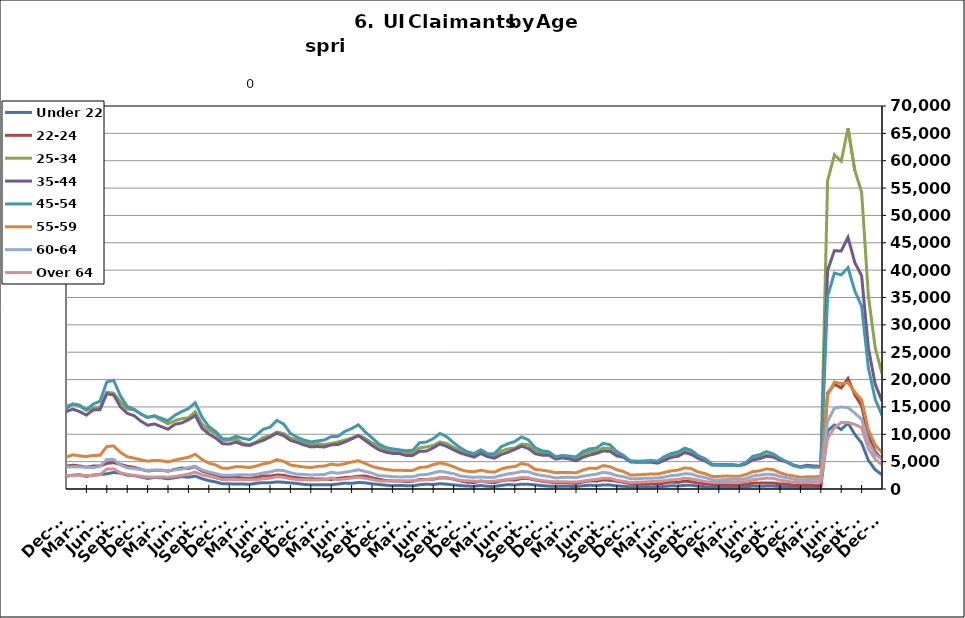
| Category | Under 22 | 22-24 | 25-34 | 35-44 | 45-54 | 55-59 | 60-64 | Over 64 |
|---|---|---|---|---|---|---|---|---|
| 1995-02-28 | 535 | 933 | 5740 | 6206 | 4029 | 1255 | 625 | 276 |
| 1995-03-31 | 534 | 992 | 5856 | 6433 | 4297 | 1294 | 686 | 323 |
| 1995-04-30 | 603 | 1125 | 6814 | 6965 | 4447 | 1392 | 730 | 338 |
| 1995-05-31 | 626 | 1171 | 7442 | 7404 | 4702 | 1383 | 751 | 333 |
| 1995-06-30 | 625 | 1218 | 7514 | 7778 | 4867 | 1435 | 813 | 366 |
| 1995-07-31 | 710 | 1296 | 8612 | 8864 | 5537 | 1595 | 891 | 407 |
| 1995-08-31 | 729 | 1248 | 8185 | 8719 | 5400 | 1604 | 982 | 406 |
| 1995-09-30 | 578 | 1028 | 6615 | 7150 | 4534 | 1351 | 862 | 338 |
| 1995-10-31 | 554 | 957 | 5805 | 6461 | 4159 | 1205 | 741 | 287 |
| 1995-11-30 | 468 | 845 | 5201 | 5826 | 3927 | 1155 | 702 | 254 |
| 1995-12-31 | 517 | 858 | 5350 | 5974 | 4010 | 1153 | 672 | 263 |
| 1996-01-31 | 543 | 927 | 5431 | 6086 | 4208 | 1221 | 685 | 301 |
| 1996-02-29 | 617 | 999 | 5667 | 6535 | 4480 | 1312 | 747 | 305 |
| 1996-03-31 | 622 | 981 | 5896 | 6557 | 4514 | 1362 | 763 | 306 |
| 1996-04-30 | 680 | 1140 | 7032 | 7649 | 5088 | 1527 | 856 | 345 |
| 1996-05-31 | 689 | 1163 | 7220 | 7819 | 5070 | 1521 | 832 | 366 |
| 1996-06-30 | 661 | 1145 | 7344 | 8173 | 5391 | 1568 | 844 | 388 |
| 1996-07-31 | 762 | 1250 | 8375 | 9181 | 6036 | 1755 | 973 | 432 |
| 1996-08-31 | 746 | 1145 | 7829 | 8585 | 5586 | 1651 | 950 | 435 |
| 1996-09-30 | 635 | 992 | 6399 | 7097 | 4790 | 1462 | 804 | 425 |
| 1996-10-31 | 572 | 851 | 5448 | 6291 | 4192 | 1259 | 693 | 340 |
| 1996-11-30 | 531 | 827 | 5003 | 5921 | 3908 | 1153 | 602 | 315 |
| 1996-12-31 | 521 | 789 | 4710 | 5510 | 3673 | 1110 | 610 | 284 |
| 1997-01-31 | 559 | 841 | 5203 | 6172 | 4321 | 1255 | 731 | 328 |
| 1997-02-28 | 556 | 841 | 5187 | 6162 | 4311 | 1250 | 727 | 326 |
| 1997-03-31 | 499 | 806 | 5125 | 6037 | 4176 | 1294 | 702 | 363 |
| 1997-04-30 | 545 | 885 | 5753 | 6709 | 4248 | 1339 | 734 | 339 |
| 1997-05-31 | 612 | 941 | 6146 | 7153 | 4458 | 1348 | 801 | 336 |
| 1997-06-30 | 623 | 995 | 6240 | 7298 | 4662 | 1302 | 776 | 348 |
| 1997-07-31 | 716 | 1154 | 7168 | 8554 | 5489 | 1509 | 903 | 415 |
| 1997-08-31 | 684 | 1072 | 6853 | 8093 | 5222 | 1487 | 837 | 416 |
| 1997-09-30 | 579 | 912 | 5522 | 6592 | 4348 | 1285 | 705 | 380 |
| 1997-10-31 | 516 | 817 | 4894.5 | 5892.5 | 3945 | 1159 | 625 | 344.5 |
| 1997-11-30 | 453 | 722 | 4267 | 5193 | 3542 | 1033 | 545 | 309 |
| 1997-12-31 | 413 | 682 | 3792 | 4755 | 3300 | 1023 | 490 | 266 |
| 1998-01-31 | 489 | 741 | 4044 | 5115 | 3513 | 1099 | 525 | 267 |
| 1998-02-28 | 435 | 684 | 3864 | 4903 | 3549 | 1043 | 571 | 285 |
| 1998-03-31 | 416 | 680 | 3855 | 5086 | 3703 | 1176 | 604 | 297 |
| 1998-04-30 | 592 | 813 | 5092 | 6219 | 4262 | 1336 | 688 | 332 |
| 1998-05-31 | 579 | 849 | 5319 | 6766 | 4554 | 1382 | 729 | 360 |
| 1998-06-30 | 568 | 899 | 5557 | 7101 | 4897 | 1405 | 783 | 367 |
| 1998-07-31 | 691 | 1031 | 6472 | 8095 | 5562 | 1589 | 880 | 392 |
| 1998-08-31 | 673 | 1007 | 6326 | 7950 | 5369 | 1574 | 935 | 393 |
| 1998-09-30 | 548 | 838 | 5206 | 6768 | 4703 | 1432 | 849 | 373 |
| 1998-10-31 | 496 | 776 | 4437 | 5582 | 3875 | 1250 | 711 | 302 |
| 1998-11-30 | 456 | 761 | 4182 | 5332 | 4015 | 1296 | 694 | 308 |
| 1998-12-31 | 442 | 722 | 4010 | 5198 | 4062 | 1331 | 656 | 290 |
| 1999-01-31 | 503 | 830 | 4502 | 5761 | 4521 | 1490 | 751 | 297 |
| 1999-02-28 | 463 | 756 | 4267 | 5576 | 4431 | 1470 | 767 | 301 |
| 1999-03-31 | 435 | 688 | 4119 | 5519 | 4403 | 1516 | 765 | 331 |
| 1999-04-30 | 591 | 949 | 5292 | 7089 | 5468 | 1724 | 914 | 489 |
| 1999-05-31 | 674 | 911 | 5611 | 7459 | 5457 | 1710 | 934 | 500 |
| 1999-06-30 | 640 | 906 | 5660 | 7503 | 5333 | 1695 | 920 | 495 |
| 1999-07-31 | 766 | 1132 | 6820 | 9256 | 6620 | 1981 | 1001 | 549 |
| 1999-08-31 | 738 | 1117 | 6737 | 9030 | 6670 | 2019 | 1075 | 582 |
| 1999-09-30 | 600 | 968 | 5167 | 7169 | 5458 | 1712 | 892 | 465 |
| 1999-10-31 | 494 | 813 | 4501 | 6048 | 4682 | 1443 | 743 | 363 |
| 1999-11-30 | 464 | 768 | 4228 | 5593 | 4564 | 1392 | 702 | 313 |
| 1999-12-31 | 468.5 | 754.5 | 4149 | 5486.5 | 4505 | 1429 | 673 | 304 |
| 2000-01-31 | 473 | 741 | 4070 | 5380 | 4446 | 1466 | 644 | 295 |
| 2000-02-29 | 460 | 691 | 3807 | 5357 | 4470 | 1469 | 707 | 310 |
| 2000-03-31 | 412 | 652 | 3864 | 5499 | 4568 | 1508 | 816 | 389 |
| 2000-04-30 | 585 | 829 | 4741 | 6891 | 5127 | 1631 | 906 | 451 |
| 2000-05-31 | 627 | 875 | 5086 | 7211 | 5238 | 1598 | 956 | 489 |
| 2000-06-30 | 675 | 983 | 5624 | 7826 | 5562 | 1669 | 941 | 524 |
| 2000-07-31 | 802 | 1109 | 6475 | 9102 | 6450 | 1927 | 1097 | 594 |
| 2000-08-31 | 787 | 1058 | 6045 | 8732 | 6157 | 1894 | 1085 | 616 |
| 2000-09-30 | 607 | 897 | 4766 | 6864 | 5037 | 1486 | 902 | 479 |
| 2000-10-31 | 544 | 760 | 4267 | 5897 | 4465 | 1323 | 762 | 394 |
| 2000-11-30 | 535 | 797 | 3982 | 5439 | 4318 | 1256 | 702 | 396 |
| 2000-12-31 | 508 | 832 | 3891 | 5255 | 4218 | 1246 | 694 | 361 |
| 2001-01-31 | 627 | 892 | 4229 | 5724 | 4777 | 1300 | 721 | 393 |
| 2001-02-28 | 643 | 934 | 4553 | 6302 | 5224 | 1529 | 849 | 472 |
| 2001-03-31 | 412 | 648 | 3625 | 5081 | 4551 | 1413 | 778 | 440 |
| 2001-04-30 | 875 | 1276 | 6577 | 8914 | 7196 | 2144 | 1185 | 639 |
| 2001-05-31 | 944 | 1399 | 7133 | 9570 | 7651 | 2265 | 1231 | 679 |
| 2001-06-30 | 1041 | 1584 | 8072 | 11034 | 8621 | 2613 | 1398 | 756 |
| 2001-07-31 | 1135 | 1806 | 9038 | 12514 | 9691 | 2970 | 1611 | 848 |
| 2001-08-31 | 1116 | 1776 | 8753 | 12045 | 9560 | 2963 | 1691 | 898 |
| 2001-09-30 | 1046 | 1705 | 8118 | 11025 | 8788 | 2784 | 1608 | 833 |
| 2001-10-31 | 1094 | 1785 | 8459 | 11114 | 8850 | 2772 | 1610 | 777 |
| 2001-11-30 | 1154 | 1931 | 9131 | 11576 | 9447 | 2973 | 1661 | 778 |
| 2001-12-31 | 1280 | 2191 | 9917 | 11961 | 9905 | 3152 | 1740 | 780 |
| 2002-01-31 | 1330 | 2255 | 10364 | 12730 | 10592 | 3378 | 1843 | 821 |
| 2002-02-28 | 1347 | 2339 | 10349 | 12730 | 10784 | 3499 | 1861 | 867 |
| 2002-03-31 | 1266 | 2231 | 9963 | 12747 | 10614 | 3499 | 1867 | 979 |
| 2002-04-30 | 1412 | 2488 | 11603 | 15825 | 13571 | 4631 | 2389 | 1146 |
| 2002-05-31 | 1455 | 2421 | 11243 | 15509 | 13148 | 4374 | 2359 | 1195 |
| 2002-06-30 | 1534 | 2479 | 11416 | 15594 | 13261 | 4343 | 2365 | 1180 |
| 2002-07-31 | 1513 | 2614 | 11895 | 16242 | 13727 | 4439 | 2428 | 1255 |
| 2002-08-31 | 1022 | 1977 | 8719 | 12054 | 10588 | 3454 | 1990 | 1047 |
| 2002-09-30 | 1391 | 2528 | 10478 | 14010 | 12008 | 3847 | 2161 | 1166 |
| 2002-10-31 | 1401 | 2385 | 9826 | 12727 | 10778 | 3498 | 1886 | 973 |
| 2002-11-30 | 1344 | 2390 | 9846 | 12059 | 10297 | 3367 | 1833 | 958 |
| 2002-12-31 | 1311 | 2403 | 9841 | 11670 | 10177 | 3369 | 1871 | 894 |
| 2003-01-31 | 1311 | 2403 | 9841 | 11670 | 10177 | 3369 | 1871 | 894 |
| 2003-02-28 | 1367 | 2275 | 9730 | 12433 | 10806 | 3687 | 2016 | 974 |
| 2003-03-31 | 1367 | 2357 | 9844 | 12620 | 11167 | 3825 | 2151 | 1094 |
| 2003-04-30 | 1549 | 2525 | 10619 | 14142 | 12182 | 4004 | 2304 | 1190 |
| 2003-05-31 | 1663 | 2698 | 10843 | 14795 | 12539 | 4102 | 2395 | 1256 |
| 2003-06-30 | 1755 | 2770 | 11350 | 15575 | 13251 | 4301 | 2493 | 1325 |
| 2003-07-31 | 1748 | 2791 | 11577 | 15863 | 13772 | 4465 | 2593 | 1371 |
| 2003-08-31 | 1718 | 2653 | 10998 | 15261 | 13219 | 4325 | 2522 | 1359 |
| 2003-09-30 | 1494 | 2521 | 10071 | 13565 | 11659 | 3828 | 2278 | 1286 |
| 2003-10-31 | 1329 | 2432 | 9388 | 12107 | 10693 | 3567 | 2036 | 1129 |
| 2003-11-30 | 1191 | 2226 | 8954 | 11297 | 10037 | 3414 | 2004 | 1068 |
| 2003-12-31 | 1206 | 2184 | 8530 | 10413 | 9335 | 3215 | 1854 | 994 |
| 2004-01-31 | 1216 | 2171 | 8382 | 9858 | 8955 | 2992 | 1736 | 963 |
| 2004-02-29 | 1118 | 1879 | 7614 | 8935 | 8176 | 2761 | 1617 | 943 |
| 2004-03-31 | 1099 | 1749 | 7152 | 8565 | 7769 | 2686 | 1608 | 981 |
| 2004-04-30 | 1241 | 1951 | 7653 | 9981 | 8741 | 2872 | 1685 | 1056 |
| 2004-05-31 | 1245 | 1934 | 7651 | 10203 | 8820 | 2928 | 1703 | 1079 |
| 2004-06-30 | 1316 | 2086 | 8172 | 10636 | 9362 | 3146 | 1843 | 1081 |
| 2004-07-31 | 1476 | 2265 | 8795 | 11511 | 10439 | 3497 | 2008 | 1171 |
| 2004-08-31 | 1390 | 2055 | 8008 | 10418 | 9514 | 3304 | 1909 | 1105 |
| 2004-09-30 | 1129 | 1820 | 6987 | 8661 | 7694 | 2755 | 1623 | 1046 |
| 2004-10-31 | 1037 | 1675 | 6590 | 7964 | 7029 | 2459 | 1461 | 882 |
| 2004-11-30 | 954 | 1638 | 6342 | 7570 | 6733 | 2294 | 1383 | 841 |
| 2004-12-31 | 857 | 1533 | 5921 | 6991 | 6333 | 2225 | 1287 | 764 |
| 2005-01-31 | 893 | 1539 | 6047 | 7410 | 6682 | 2253 | 1274 | 788 |
| 2005-02-28 | 846 | 1361 | 5650 | 6952 | 6404 | 2198 | 1326 | 786 |
| 2005-03-31 | 747 | 1258 | 5313 | 6595 | 6251 | 2151 | 1327 | 742 |
| 2005-04-30 | 877 | 1375 | 5696 | 7717 | 7230 | 2440 | 1401 | 844 |
| 2005-05-31 | 854 | 1408 | 5674 | 7905 | 7454 | 2482 | 1453 | 858 |
| 2005-06-30 | 819 | 1444 | 6028 | 8565 | 7899 | 2613 | 1547 | 890 |
| 2005-07-31 | 900 | 1461 | 6395 | 9124 | 8614 | 2864 | 1640 | 1004 |
| 2005-08-31 | 805 | 1439 | 5917 | 8271 | 8076 | 2692 | 1587 | 945 |
| 2005-09-30 | 631 | 1209 | 4978 | 6413 | 6203 | 2116 | 1312 | 724 |
| 2005-10-31 | 638 | 1134 | 4602 | 6028 | 5688 | 1997 | 1171 | 656 |
| 2005-11-30 | 564 | 1071 | 4409 | 5563 | 5105 | 1791 | 1035 | 580 |
| 2005-12-31 | 523 | 987 | 4014 | 4983 | 4531 | 1673 | 968 | 546 |
| 2006-01-31 | 531 | 925 | 3900 | 5012 | 4793 | 1691 | 1008 | 539 |
| 2006-02-28 | 447 | 804 | 3534 | 4388 | 4403 | 1586 | 980 | 549 |
| 2006-03-31 | 399 | 785 | 3455 | 4472 | 4584 | 1680 | 1069 | 618 |
| 2006-04-30 | 527 | 945 | 4004 | 5859 | 5921 | 1965 | 1251 | 744 |
| 2006-05-31 | 594 | 964 | 4205 | 6365 | 6369 | 2156 | 1327 | 792 |
| 2006-06-30 | 660 | 1113 | 4742 | 7052 | 7094 | 2386 | 1474 | 933 |
| 2006-07-31 | 771 | 1183 | 5214 | 7974 | 8007 | 2685 | 1635 | 1072 |
| 2006-08-31 | 737 | 1202 | 5116 | 7524 | 7553 | 2671 | 1590 | 1019 |
| 2006-09-30 | 596 | 1086 | 4608 | 6175 | 6389 | 2256 | 1287 | 812 |
| 2006-10-31 | 596 | 1056 | 4585 | 5758 | 5788 | 2026 | 1164 | 696 |
| 2006-11-30 | 542 | 1003 | 4370 | 5304 | 5388 | 1812 | 1082 | 604 |
| 2006-12-31 | 553 | 1102 | 4425 | 5291 | 5310 | 1801 | 1099 | 603 |
| 2007-01-31 | 587 | 1147 | 4542 | 5619 | 5506 | 1920 | 1174 | 663 |
| 2007-02-28 | 544 | 1090 | 4490 | 5562 | 5616 | 1982 | 1260 | 705 |
| 2007-03-31 | 558 | 1089 | 4498 | 5595 | 5708 | 2016 | 1378 | 717 |
| 2007-04-30 | 760 | 1203 | 5015 | 6827 | 6871 | 2316 | 1536 | 856 |
| 2007-05-31 | 806 | 1285 | 5542 | 7679 | 7763 | 2571 | 1719 | 1021 |
| 2007-06-30 | 862 | 1340 | 6100 | 8324 | 8341 | 2812 | 1896 | 1060 |
| 2007-07-31 | 980 | 1524 | 6616 | 9184 | 9522 | 3226 | 2038 | 1250 |
| 2007-08-31 | 950 | 1510 | 6266 | 8359 | 8842 | 3033 | 1949 | 1157 |
| 2007-09-30 | 865 | 1595 | 6213 | 7798 | 7957 | 2790 | 1816 | 1090 |
| 2007-10-31 | 883 | 1517 | 6214 | 7229 | 7503 | 2574 | 1630 | 978 |
| 2007-11-15 | 816 | 1424 | 5981 | 6740 | 6999 | 2468 | 1510 | 860 |
| 2007-12-15 09:36:00 | 851 | 1536 | 6411 | 6986 | 7174 | 2572 | 1584 | 874 |
| 2008-01-14 19:12:00 | 963 | 1628 | 6836 | 7533 | 7742 | 2786 | 1744 | 940 |
| 2008-02-14 04:48:00 | 982 | 1565 | 6847 | 7767 | 8031 | 2958 | 1823 | 985 |
| 2008-03-15 14:24:00 | 1029 | 1666 | 7210 | 8036 | 8353 | 3105 | 1898 | 1085 |
| 2008-04-15 | 1182 | 1889 | 7894 | 9339 | 9822 | 3537 | 2184 | 1246 |
| 2008-05-15 09:36:00 | 1325 | 2099 | 8651 | 10315 | 11003 | 3871 | 2423 | 1448 |
| 2008-06-14 19:12:00 | 1405 | 2238 | 9567 | 11330 | 12040 | 4322 | 2650 | 1572 |
| 2008-07-15 04:48:00 | 1616 | 2488 | 10336 | 12349 | 13396 | 4698 | 3083 | 1801 |
| 2008-08-14 14:24:00 | 1753 | 2665 | 10716 | 12486 | 13444 | 4795 | 3139 | 1802 |
| 2008-09-14 | 1800 | 2924 | 11552 | 12686 | 13602 | 4801 | 3180 | 1811 |
| 2008-10-14 09:36:00 | 1936 | 3131 | 12284 | 13322 | 13831 | 4989 | 3183 | 1808 |
| 2008-11-13 19:12:00 | 2093 | 3414 | 13577 | 14724 | 15130 | 5413 | 3440 | 1946 |
| 2008-12-14 04:48:00 | 2495 | 4020 | 15380 | 16325 | 16846 | 6098 | 3755 | 2155 |
| 2009-01-13 14:24:00 | 3054 | 4678 | 17678 | 18452 | 19095 | 6788 | 4182 | 2364 |
| 2009-02-13 | 3531 | 5304 | 19793 | 20788 | 21601 | 7727 | 4836 | 2718 |
| 2009-03-15 09:36:00 | 3891 | 5925 | 22303 | 23139 | 24352 | 8876 | 5515 | 3141 |
| 2009-04-14 19:12:00 | 4291 | 6403 | 23925 | 25362 | 26817 | 9618 | 6020 | 3494 |
| 2009-05-15 04:48:00 | 4410 | 6521 | 24301 | 25794 | 27238 | 9735 | 6181 | 3529 |
| 2009-06-14 14:24:00 | 4405 | 6853 | 25234 | 26806 | 28296 | 10256 | 6673 | 3804 |
| 2009-07-15 | 4729 | 7280 | 26132 | 27836 | 29724 | 10830 | 6950 | 4125 |
| 2009-08-14 09:36:00 | 4717 | 7069 | 25281 | 26184 | 27877 | 10164 | 6719 | 3918 |
| 2009-09-13 19:12:00 | 4741 | 7291 | 25029 | 24981 | 26018 | 9679 | 6210 | 3594 |
| 2009-10-14 04:48:00 | 4656 | 7051 | 24241 | 23779 | 24730 | 9034 | 5817 | 3422 |
| 2009-11-13 14:24:00 | 4421 | 6817 | 23760 | 22851 | 23515 | 8627 | 5549 | 3297 |
| 2009-12-14 | 4232 | 6586 | 23118 | 22038 | 22501 | 8496 | 5370 | 3295 |
| 2010-01-13 09:36:00 | 4276 | 6583 | 22706 | 21421 | 22132 | 8135 | 5154 | 3134 |
| 2010-02-12 19:12:00 | 4133 | 6142 | 21386 | 20012 | 21036 | 7728 | 5039 | 3047 |
| 2010-03-15 04:48:00 | 3784 | 5822 | 20418 | 19073 | 20556 | 7446 | 4983 | 3062 |
| 2010-04-14 14:24:00 | 3731 | 5751 | 20058 | 19261 | 21012 | 7449 | 5078 | 2936 |
| 2010-05-15 | 3516 | 5553 | 19393 | 18793 | 20409 | 7213 | 4923 | 2915 |
| 2010-06-14 09:36:00 | 3450 | 5640 | 19615 | 19385 | 20781 | 7547 | 5293 | 3043 |
| 2010-07-14 19:12:00 | 3536 | 5781 | 19820 | 19714 | 21269 | 7946 | 5439 | 3330 |
| 2010-08-14 04:48:00 | 3477 | 5590 | 18902 | 18548 | 19686 | 7561 | 5039 | 3181 |
| 2010-09-13 14:24:00 | 3083 | 5332 | 17344 | 16712 | 17408 | 6775 | 4612 | 2859 |
| 2010-10-14 | 3004 | 5138 | 17187 | 16492 | 17042 | 6713 | 4418 | 2779 |
| 2010-11-13 09:36:00 | 2724 | 4771 | 16387 | 15438 | 16061 | 6360 | 4209 | 2601 |
| 2010-12-13 19:12:00 | 2335 | 4159 | 15175 | 14143 | 14646 | 5823 | 4003 | 2480 |
| 2011-01-13 04:48:00 | 2530 | 4343 | 15492 | 14596 | 15561 | 6250 | 4059 | 2487 |
| 2011-02-12 14:24:00 | 2609 | 4202 | 15131 | 14142 | 15320 | 6044 | 4041 | 2517 |
| 2011-03-15 | 2290 | 3998 | 14370 | 13505 | 14523 | 5925 | 3990 | 2470 |
| 2011-04-14 09:36:00 | 2563 | 4190 | 14834 | 14445 | 15508 | 6130 | 3916 | 2488 |
| 2011-05-14 19:12:00 | 2642 | 4217 | 14917 | 14494 | 16051 | 6156 | 4129 | 2602 |
| 2011-06-14 04:48:00 | 2767 | 4676 | 17673 | 17404 | 19563 | 7763 | 5398 | 3653 |
| 2011-07-14 14:24:00 | 3027 | 4815 | 17530 | 17197 | 19880 | 7870 | 5384 | 3686 |
| 2011-08-14 | 2900 | 4498 | 15970 | 15020 | 17035 | 6697 | 4394 | 2956 |
| 2011-09-13 09:36:00 | 2531 | 4156 | 14609 | 13818 | 15092 | 5903 | 3881 | 2687 |
| 2011-10-13 19:12:00 | 2452 | 3959 | 14501 | 13415 | 14565 | 5635 | 3734 | 2491 |
| 2011-11-13 04:48:00 | 2197 | 3615 | 13732 | 12410 | 13698 | 5345 | 3574 | 2339 |
| 2011-12-13 14:24:00 | 1938 | 3290 | 13130 | 11646 | 13054 | 5089 | 3380 | 2177 |
| 2012-01-13 | 2098 | 3424 | 13293 | 11897 | 13400 | 5218 | 3448 | 2197 |
| 2012-02-12 09:36:00 | 2047 | 3428 | 12569 | 11400 | 12931 | 5177 | 3445 | 2212 |
| 2012-03-13 19:12:00 | 1870 | 3252 | 11913 | 10922 | 12476 | 4948 | 3317 | 2155 |
| 2012-04-13 04:48:00 | 2063 | 3590 | 12479 | 11814 | 13464 | 5278 | 3509 | 2287 |
| 2012-05-13 14:24:00 | 2260 | 3828 | 12852 | 12063 | 14139 | 5562 | 3628 | 2485 |
| 2012-06-13 | 2147 | 3747 | 13008 | 12659 | 14694 | 5791 | 3902 | 2736 |
| 2012-07-13 09:36:00 | 2358 | 4087 | 14109 | 13412 | 15770 | 6346 | 4156 | 3086 |
| 2012-08-12 19:12:00 | 1887 | 3284 | 11852 | 11102 | 13153 | 5396 | 3487 | 2583 |
| 2012-09-12 04:48:00 | 1524 | 2903 | 10742 | 10051 | 11393 | 4726 | 3103 | 2327 |
| 2012-10-12 14:24:00 | 1289 | 2603 | 10123 | 9339 | 10510 | 4405 | 2813 | 2032 |
| 2012-11-12 | 945 | 2155 | 8870 | 8273 | 9193 | 3781 | 2520 | 1702 |
| 2012-12-12 09:36:00 | 937 | 2201 | 8913 | 8210 | 9124 | 3816 | 2491 | 1722 |
| 2013-01-11 19:12:00 | 934 | 2199 | 9132 | 8579 | 9635 | 4095 | 2569 | 1667 |
| 2013-02-11 04:48:00 | 915 | 1996 | 8343 | 8072 | 9253 | 4034 | 2623 | 1715 |
| 2013-03-13 14:24:00 | 845 | 1934 | 8092 | 7955 | 9007 | 3929 | 2561 | 1667 |
| 2013-04-13 | 1055 | 2124 | 8637 | 8445 | 9891 | 4204 | 2666 | 1698 |
| 2013-05-13 09:36:00 | 1160 | 2394 | 9413 | 8898 | 10920 | 4574 | 2940 | 1871 |
| 2013-06-12 19:12:00 | 1145 | 2351 | 9732 | 9510 | 11293 | 4830 | 3115 | 1976 |
| 2013-07-13 04:48:00 | 1294 | 2558 | 10421 | 10174 | 12520 | 5363 | 3434 | 2233 |
| 2013-08-12 14:24:00 | 1238 | 2519 | 10150 | 9771 | 11886 | 5067 | 3372 | 2140 |
| 2013-09-12 | 1116 | 2214 | 9323 | 8874 | 10178 | 4389 | 2964 | 1871 |
| 2013-10-12 09:36:00 | 1000 | 2044 | 8893 | 8509 | 9449 | 4200 | 2701 | 1709 |
| 2013-11-11 19:12:00 | 842 | 1927 | 8532 | 8049 | 8950 | 4028 | 2665 | 1675 |
| 2013-12-12 04:48:00 | 753 | 1854 | 8098 | 7692 | 8612 | 3913 | 2557 | 1655 |
| 2014-01-11 14:24:00 | 788 | 1846 | 8270 | 7762 | 8786 | 4128 | 2606 | 1642 |
| 2014-02-11 | 795 | 1817 | 8124 | 7677 | 8944 | 4189 | 2646 | 1728 |
| 2014-03-13 09:36:00 | 782 | 1741 | 8319 | 8063 | 9583 | 4550 | 3048 | 2040 |
| 2014-04-12 19:12:00 | 905 | 1940 | 8594 | 8138 | 9620 | 4372 | 2886 | 1706 |
| 2014-05-13 04:48:00 | 1079 | 2093 | 8933 | 8593 | 10522 | 4609 | 3062 | 1850 |
| 2014-06-12 14:24:00 | 1028 | 2152 | 9323 | 9148 | 11040 | 4920 | 3274 | 1985 |
| 2014-07-13 | 1189 | 2333 | 9808 | 9735 | 11729 | 5171 | 3509 | 2133 |
| 2014-08-14 | 1119 | 2379 | 9259 | 8876 | 10438 | 4678 | 3210 | 1962 |
| 2014-09-13 09:36:00 | 943 | 2048 | 8430 | 7946 | 9358 | 4119 | 2891 | 1734 |
| 2014-10-13 19:12:00 | 816 | 1781 | 7821 | 7185 | 8244 | 3813 | 2437 | 1486 |
| 2014-11-13 04:48:00 | 703 | 1557 | 7150 | 6736 | 7594 | 3571 | 2374 | 1466 |
| 2014-12-13 14:24:00 | 597 | 1482 | 6833 | 6507 | 7340 | 3442 | 2255 | 1458 |
| 2015-01-13 | 646 | 1466 | 6927 | 6477 | 7168 | 3432 | 2210 | 1429 |
| 2015-02-12 09:36:00 | 607 | 1346 | 6696 | 6134 | 6999 | 3383 | 2220 | 1525 |
| 2015-03-14 19:12:00 | 577 | 1416 | 6499 | 6145 | 7077 | 3405 | 2233 | 1530 |
| 2015-04-14 04:48:00 | 784 | 1736 | 7505 | 6901 | 8468 | 3935 | 2586 | 1624 |
| 2015-05-14 14:24:00 | 875 | 1749 | 7696 | 6925 | 8578 | 4020 | 2644 | 1698 |
| 2015-06-14 | 818 | 1789 | 7961 | 7519 | 9200 | 4452 | 2943 | 1839 |
| 2015-07-14 09:36:00 | 966 | 2033 | 8609 | 8223 | 10167 | 4766 | 3254 | 2136 |
| 2015-08-13 19:12:00 | 880 | 2007 | 8302 | 7779 | 9530 | 4503 | 3045 | 2073 |
| 2015-09-13 04:48:00 | 752 | 1807 | 7615 | 7153 | 8455 | 4067 | 2798 | 1870 |
| 2015-10-13 14:24:00 | 630 | 1461 | 6995 | 6578 | 7509 | 3519 | 2375 | 1570 |
| 2015-11-13 | 533 | 1246 | 6491 | 6196 | 6815 | 3237 | 2224 | 1493 |
| 2015-12-13 09:36:00 | 512 | 1179 | 6242 | 5823 | 6474 | 3158 | 2123 | 1439 |
| 2016-01-12 19:12:00 | 646 | 1466 | 6927 | 6477 | 7168 | 3432 | 2210 | 1429 |
| 2016-02-12 04:48:00 | 482 | 1246 | 6101 | 5912 | 6452 | 3180 | 2110 | 1385 |
| 2016-03-13 14:24:00 | 474 | 1170 | 6011 | 5629 | 6452 | 3073 | 2152 | 1420 |
| 2016-04-13 | 648 | 1494 | 6917 | 6287 | 7737 | 3648 | 2483 | 1600 |
| 2016-05-13 09:36:00 | 812 | 1670 | 7326 | 6725 | 8279 | 3967 | 2765 | 1776 |
| 2016-06-12 19:12:00 | 738 | 1622 | 7479 | 7230 | 8681 | 4111 | 2920 | 1886 |
| 2016-07-13 04:48:00 | 875 | 1919 | 8193 | 7814 | 9525 | 4662 | 3196 | 2105 |
| 2016-08-12 14:24:00 | 858 | 1920 | 8091 | 7407 | 8969 | 4420 | 3130 | 2050 |
| 2016-09-12 | 752 | 1632 | 6992 | 6450 | 7548 | 3573 | 2713 | 1747 |
| 2016-10-12 09:36:00 | 602 | 1423 | 6590 | 6190 | 6998 | 3448 | 2457 | 1544 |
| 2016-11-11 19:12:00 | 523 | 1296 | 6418 | 6179 | 6801 | 3241 | 2299 | 1410 |
| 2016-12-12 04:48:00 | 468 | 1096 | 5827 | 5472 | 5867 | 2981 | 2019 | 1311 |
| 2017-01-11 14:24:00 | 495 | 1150 | 6111 | 5679 | 6108 | 3035 | 2115 | 1342 |
| 2017-02-11 | 484 | 1109 | 5882 | 5500 | 6023 | 3023 | 2148 | 1289 |
| 2017-03-13 09:36:00 | 442 | 1015 | 5634 | 5148 | 5865 | 2942 | 2075 | 1278 |
| 2017-04-12 19:12:00 | 585 | 1285 | 6292 | 5783 | 6842 | 3434 | 2336 | 1435 |
| 2017-05-13 04:48:00 | 686 | 1492 | 6844 | 6200 | 7332 | 3817 | 2526 | 1637 |
| 2017-06-12 14:24:00 | 623 | 1435 | 6852 | 6505 | 7473 | 3751 | 2713 | 1754 |
| 2017-07-13 | 745 | 1658 | 7483 | 6953 | 8339 | 4284 | 3038 | 1964 |
| 2017-08-12 09:36:00 | 745 | 1605 | 7411 | 6880 | 8092 | 4080 | 2878 | 1966 |
| 2017-09-11 19:12:00 | 559 | 1420 | 6481 | 6045 | 6845 | 3511 | 2443 | 1591 |
| 2017-10-12 04:48:00 | 503 | 1224 | 5960 | 5790 | 6135 | 3181 | 2245 | 1400 |
| 2017-11-11 14:24:00 | 390 | 972 | 5167 | 4951 | 5077 | 2553 | 1887 | 1188 |
| 2017-12-12 | 413 | 914 | 5058 | 4876 | 5071 | 2585 | 1870 | 1226 |
| 2018-01-11 09:36:00 | 411 | 912 | 5154 | 4909 | 5000 | 2656 | 1952 | 1288 |
| 2018-02-10 19:12:00 | 383 | 940 | 5246 | 4884 | 5165 | 2743 | 1980 | 1355 |
| 2018-03-13 04:48:00 | 373 | 875 | 5018 | 4724 | 5075 | 2723 | 1999 | 1389 |
| 2018-04-12 14:24:00 | 478 | 1104 | 5584 | 5240 | 5944 | 3026 | 2179 | 1506 |
| 2018-05-13 | 586 | 1275 | 6280 | 5780 | 6500 | 3300 | 2452 | 1670 |
| 2018-06-12 09:36:00 | 554 | 1207 | 6302 | 5974 | 6766 | 3462 | 2534 | 1762 |
| 2018-07-12 19:12:00 | 666 | 1445 | 7024 | 6656 | 7473 | 3858 | 2810 | 1989 |
| 2018-08-12 04:48:00 | 671 | 1323 | 6823 | 6293 | 7046 | 3706 | 2722 | 1850 |
| 2018-09-11 14:24:00 | 518 | 1084 | 5965 | 5563 | 6066 | 3091 | 2318 | 1618 |
| 2018-10-12 | 419 | 985 | 5538 | 5106 | 5464 | 2806 | 2102 | 1367 |
| 2018-11-11 09:36:00 | 306 | 808 | 4542 | 4371 | 4433 | 2297 | 1673 | 1222 |
| 2018-12-11 19:12:00 | 328 | 771 | 4439 | 4429 | 4340 | 2303 | 1646 | 1174 |
| 2019-01-11 04:48:00 | 327 | 743 | 4491 | 4378 | 4359 | 2368 | 1715 | 1218 |
| 2019-02-10 14:24:00 | 338 | 739 | 4402 | 4415 | 4345 | 2337 | 1773 | 1237 |
| 2019-03-13 | 306 | 738 | 4246 | 4293 | 4304 | 2328 | 1756 | 1281 |
| 2019-04-12 09:36:00 | 396 | 850 | 4657 | 4603 | 4871 | 2655 | 1900 | 1347 |
| 2019-05-12 19:12:00 | 541 | 1092 | 5700 | 5319 | 5974 | 3169 | 2371 | 1690 |
| 2019-06-12 04:48:00 | 476 | 1070 | 5822 | 5537 | 6262 | 3317 | 2534 | 1820 |
| 2019-07-12 14:24:00 | 538 | 1114 | 6206 | 5980 | 6836 | 3673 | 2717 | 1996 |
| 2019-08-12 | 528 | 1084 | 6044 | 5828 | 6422 | 3535 | 2645 | 1942 |
| 2019-09-11 09:36:00 | 445 | 932 | 5379 | 5275 | 5630 | 2979 | 2299 | 1624 |
| 2019-10-11 19:12:00 | 372 | 877 | 4949 | 4938 | 4922 | 2579 | 2058 | 1418 |
| 2019-11-11 04:48:00 | 332 | 701 | 4242 | 4332 | 4379 | 2392 | 1809 | 1247 |
| 2019-12-11 14:24:00 | 261 | 663 | 3977 | 4071 | 3974 | 2137 | 1619 | 1150 |
| 2020-01-11 | 272 | 724 | 4153 | 4331 | 4085 | 2258 | 1715 | 1206 |
| 2020-02-10 09:36:00 | 274 | 704 | 3992 | 4211 | 4020 | 2226 | 1784 | 1286 |
| 2020-03-11 19:12:00 | 291 | 630 | 3985 | 4153 | 4136 | 2332 | 1794 | 1308 |
| 2020-04-11 04:48:00 | 10628 | 17510 | 56346 | 39970 | 35225 | 17140 | 12379 | 9237 |
| 2020-05-11 14:24:00 | 11700 | 19159 | 61067 | 43562 | 39459 | 19553 | 14765 | 11197 |
| 2020-06-11 | 10859 | 18470 | 59897 | 43484 | 39131 | 19246 | 15000 | 12140 |
| 2020-07-11 09:36:00 | 12066 | 20204 | 65924 | 45983 | 40459 | 19436 | 14870 | 12160 |
| 2020-08-10 19:12:00 | 9989 | 17237 | 58218 | 41395 | 36191 | 17725 | 13875 | 11793 |
| 2020-09-10 04:48:00 | 8425 | 15201 | 54260 | 38988 | 33440 | 16290 | 12758 | 11237 |
| 2020-10-10 14:24:00 | 5224 | 9693 | 35264 | 25722 | 22091 | 10801 | 8611 | 7331 |
| 2020-11-10 | 3533 | 6796 | 25816 | 19183 | 16424 | 8018 | 6314 | 5449 |
| 2020-12-10 09:36:00 | 2593 | 5424 | 21071 | 16063 | 13455 | 6630 | 5449 | 4436 |